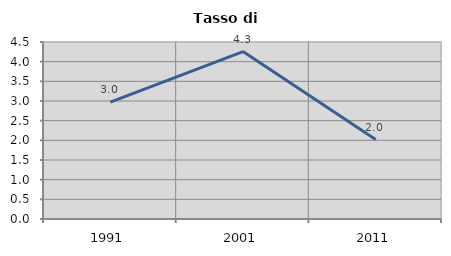
| Category | Tasso di disoccupazione   |
|---|---|
| 1991.0 | 2.97 |
| 2001.0 | 4.255 |
| 2011.0 | 2.02 |